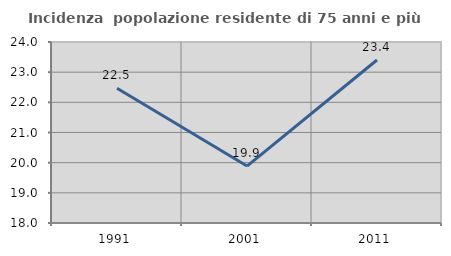
| Category | Incidenza  popolazione residente di 75 anni e più |
|---|---|
| 1991.0 | 22.469 |
| 2001.0 | 19.888 |
| 2011.0 | 23.404 |